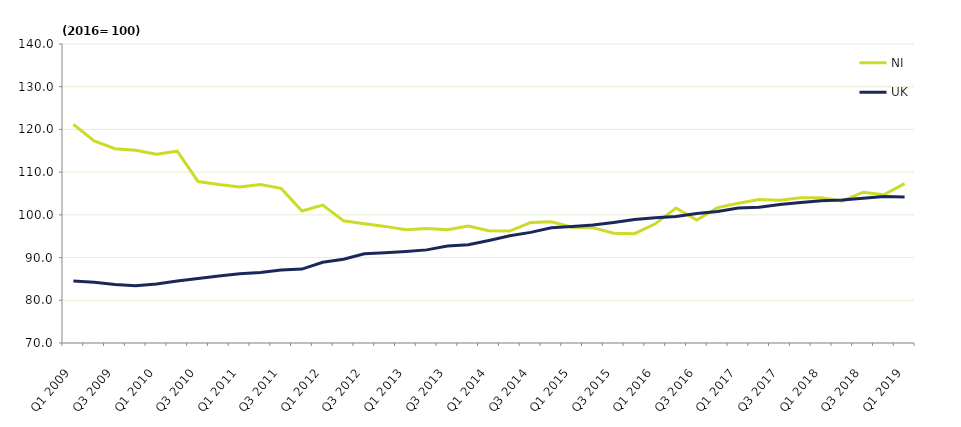
| Category | NI | UK |
|---|---|---|
| Q1 2009 | 121.2 | 84.5 |
| Q2 2009 | 117.3 | 84.2 |
| Q3 2009 | 115.5 | 83.7 |
| Q4 2009 | 115.1 | 83.4 |
| Q1 2010 | 114.2 | 83.8 |
| Q2 2010 | 114.9 | 84.5 |
| Q3 2010 | 107.8 | 85.1 |
| Q4 2010 | 107.1 | 85.7 |
| Q1 2011 | 106.5 | 86.2 |
| Q2 2011 | 107.1 | 86.5 |
| Q3 2011 | 106.2 | 87.1 |
| Q4 2011 | 100.9 | 87.3 |
| Q1 2012 | 102.3 | 88.9 |
| Q2 2012 | 98.6 | 89.6 |
| Q3 2012 | 97.9 | 90.9 |
| Q4 2012 | 97.3 | 91.1 |
| Q1 2013 | 96.5 | 91.4 |
| Q2 2013 | 96.8 | 91.8 |
| Q3 2013 | 96.5 | 92.7 |
| Q4 2013 | 97.4 | 93 |
| Q1 2014 | 96.3 | 94 |
| Q2 2014 | 96.2 | 95.1 |
| Q3 2014 | 98.2 | 95.9 |
| Q4 2014 | 98.4 | 97 |
| Q1 2015 | 97.1 | 97.3 |
| Q2 2015 | 97 | 97.6 |
| Q3 2015 | 95.7 | 98.2 |
| Q4 2015 | 95.6 | 98.9 |
| Q1 2016 | 97.9 | 99.3 |
| Q2 2016 | 101.6 | 99.6 |
| Q3 2016 | 98.8 | 100.3 |
| Q4 2016 | 101.7 | 100.8 |
| Q1 2017 | 102.7 | 101.6 |
| Q2 2017 | 103.6 | 101.8 |
| Q3 2017 | 103.4 | 102.4 |
| Q4 2017 | 104 | 102.9 |
| Q1 2018 | 104 | 103.3 |
| Q2 2018 | 103.2 | 103.5 |
| Q3 2018 | 105.3 | 103.9 |
| Q4 2018 | 104.7 | 104.3 |
| Q1 2019 | 107.3 | 104.2 |